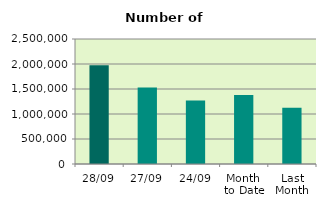
| Category | Series 0 |
|---|---|
| 28/09 | 1974788 |
| 27/09 | 1530972 |
| 24/09 | 1269662 |
| Month 
to Date | 1382284.8 |
| Last
Month | 1124493.364 |